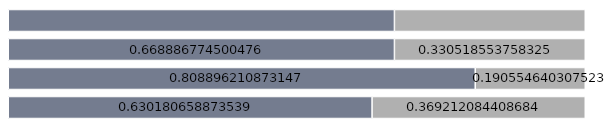
| Category | Deutsche | Ausländer |
|---|---|---|
| 1 | 0.63 | 0.369 |
| 2 | 0.809 | 0.191 |
| 3 | 0.669 | 0.331 |
| 4 | 0.669 | 0.331 |